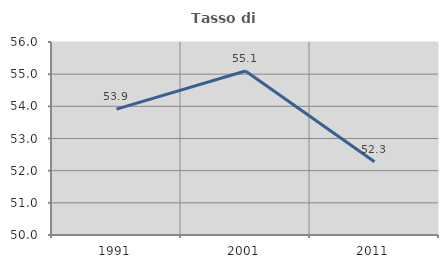
| Category | Tasso di occupazione   |
|---|---|
| 1991.0 | 53.913 |
| 2001.0 | 55.1 |
| 2011.0 | 52.277 |